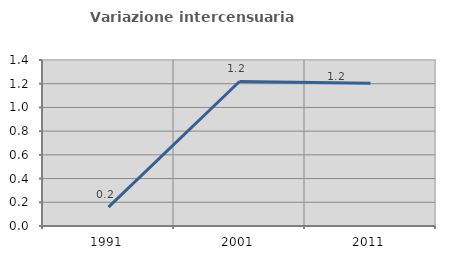
| Category | Variazione intercensuaria annua |
|---|---|
| 1991.0 | 0.159 |
| 2001.0 | 1.219 |
| 2011.0 | 1.203 |